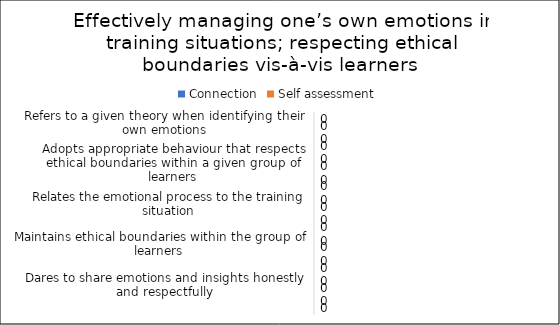
| Category | Connection | Self assessment |
|---|---|---|
| Refers to a given theory when identifying their own emotions | 0 | 0 |
| Demonstrates an understanding of emotional processes and methods  | 0 | 0 |
| Adopts appropriate behaviour that respects ethical boundaries within a given group of learners | 0 | 0 |
| Recognises and reflects on their own emotions  | 0 | 0 |
| Relates the emotional process to the training situation | 0 | 0 |
| Shares their own emotions with the group in an educational way  | 0 | 0 |
| Maintains ethical boundaries within the group of learners | 0 | 0 |
| Empathises with learners  | 0 | 0 |
| Dares to share emotions and insights honestly and respectfully | 0 | 0 |
| Accepts unpredictable reactions from others | 0 | 0 |